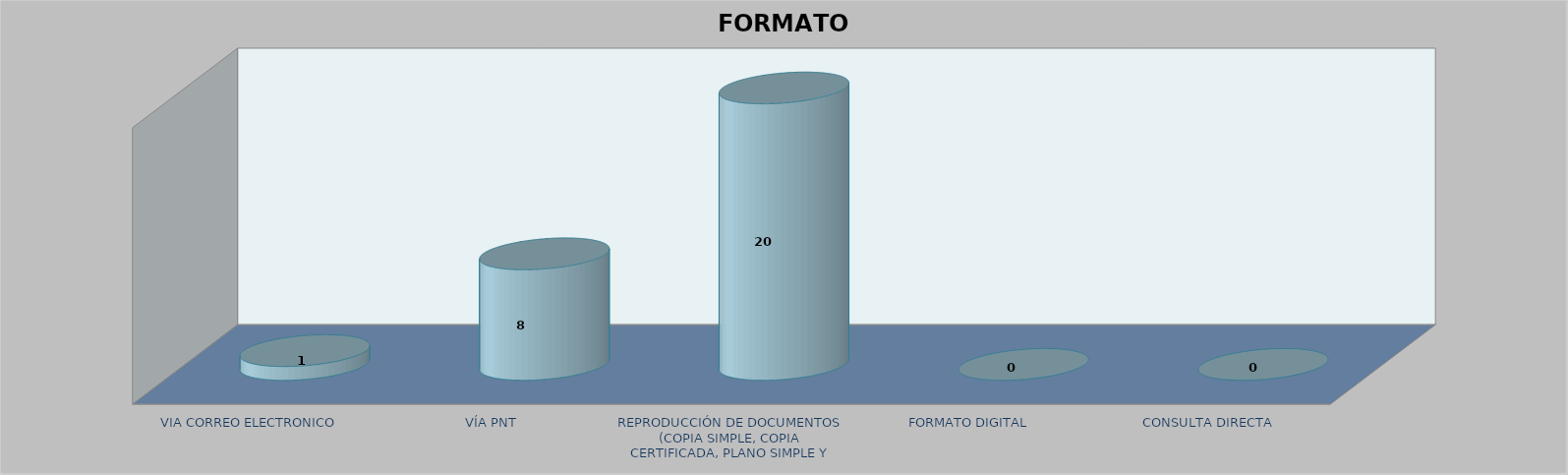
| Category |        FORMATO SOLICITADO | Series 1 | Series 2 |
|---|---|---|---|
| VIA CORREO ELECTRONICO |  |  | 1 |
| VÍA PNT |  |  | 8 |
| REPRODUCCIÓN DE DOCUMENTOS (COPIA SIMPLE, COPIA CERTIFICADA, PLANO SIMPLE Y PLANO CERTIFICADO) |  |  | 20 |
| FORMATO DIGITAL |  |  | 0 |
| CONSULTA DIRECTA |  |  | 0 |